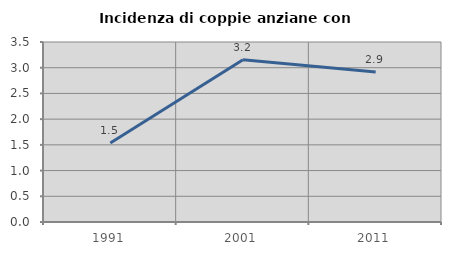
| Category | Incidenza di coppie anziane con figli |
|---|---|
| 1991.0 | 1.536 |
| 2001.0 | 3.156 |
| 2011.0 | 2.918 |